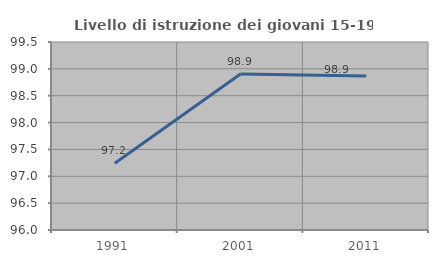
| Category | Livello di istruzione dei giovani 15-19 anni |
|---|---|
| 1991.0 | 97.243 |
| 2001.0 | 98.905 |
| 2011.0 | 98.866 |